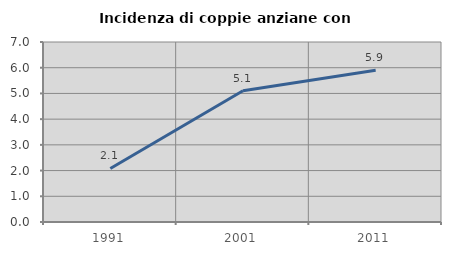
| Category | Incidenza di coppie anziane con figli |
|---|---|
| 1991.0 | 2.083 |
| 2001.0 | 5.103 |
| 2011.0 | 5.9 |